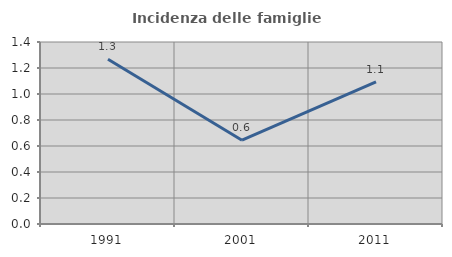
| Category | Incidenza delle famiglie numerose |
|---|---|
| 1991.0 | 1.268 |
| 2001.0 | 0.645 |
| 2011.0 | 1.093 |